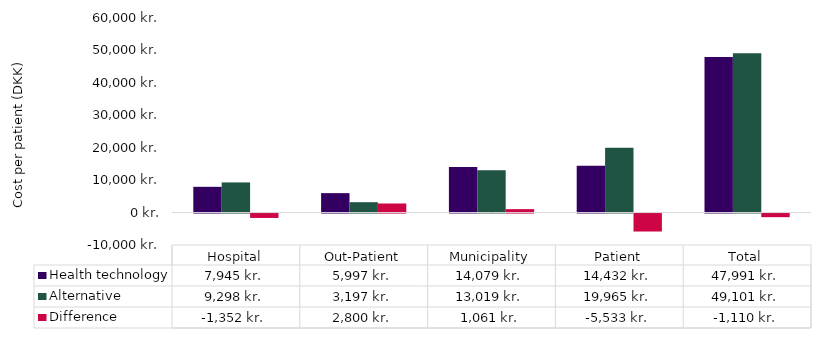
| Category | Health technology | Alternative | Difference |
|---|---|---|---|
| Hospital | 7945.47 | 9297.91 | -1352.44 |
| Out-Patient | 5997.46 | 3197.46 | 2800 |
| Municipality | 14079 | 13018.5 | 1060.5 |
| Patient | 14432 | 19965 | -5533 |
| Total | 47990.964 | 49101.37 | -1110.406 |